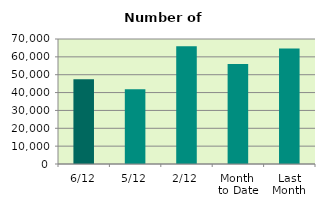
| Category | Series 0 |
|---|---|
| 6/12 | 47484 |
| 5/12 | 41928 |
| 2/12 | 65952 |
| Month 
to Date | 56032.5 |
| Last
Month | 64659.273 |